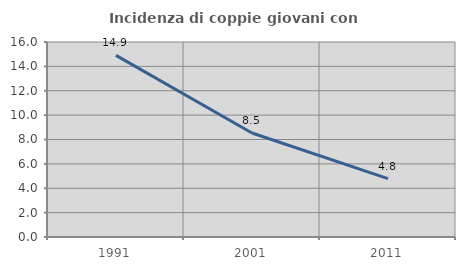
| Category | Incidenza di coppie giovani con figli |
|---|---|
| 1991.0 | 14.9 |
| 2001.0 | 8.537 |
| 2011.0 | 4.792 |